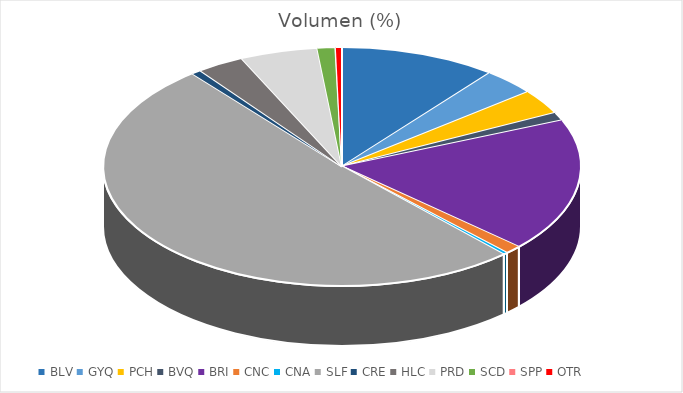
| Category | Volumen (%) |
|---|---|
| BLV | 581311.88 |
| GYQ | 197112.43 |
| PCH | 183040 |
| BVQ | 59457.7 |
| BRI | 988000 |
| CNC | 61675 |
| CNA | 16417 |
| SLF | 2790663.28 |
| CRE | 36530 |
| HLC | 174580 |
| PRD | 287942.74 |
| SCD | 66348.75 |
| SPP | 1615 |
| OTR | 22555.36 |